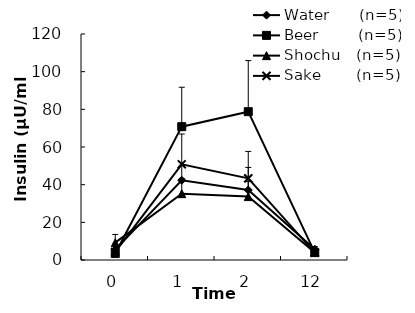
| Category | Water      (n=5) | Beer        (n=5) | Shochu   (n=5) | Sake       (n=5) |
|---|---|---|---|---|
| 0.0 | 5.48 | 3.46 | 9.2 | 4.28 |
| 1.0 | 42.34 | 70.8 | 35.22 | 50.8 |
| 2.0 | 37.16 | 78.76 | 33.66 | 43.36 |
| 12.0 | 5.72 | 3.92 | 4 | 3.92 |